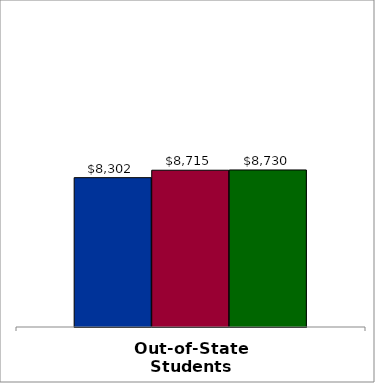
| Category | 50 states and D.C. | SREB states | State |
|---|---|---|---|
| Out-of-State Students | 8302 | 8715 | 8730 |